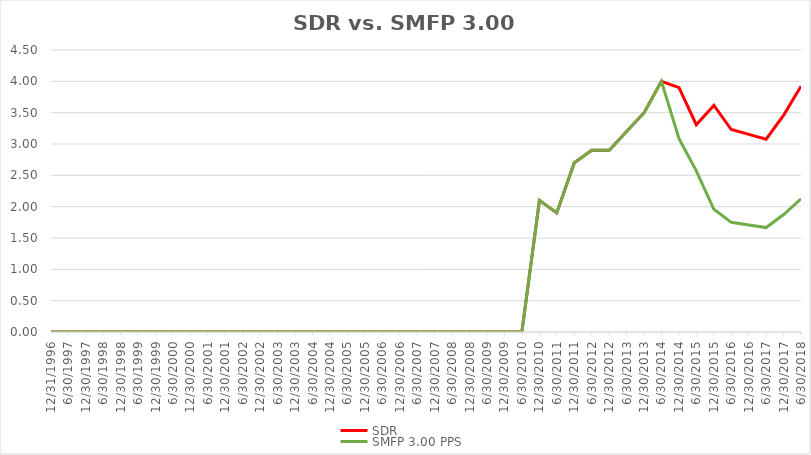
| Category | SDR | SMFP 3.00 PPS |
|---|---|---|
| 12/31/96 | 0 | 0 |
| 6/30/97 | 0 | 0 |
| 12/31/97 | 0 | 0 |
| 6/30/98 | 0 | 0 |
| 12/31/98 | 0 | 0 |
| 6/30/99 | 0 | 0 |
| 12/31/99 | 0 | 0 |
| 6/30/00 | 0 | 0 |
| 12/31/00 | 0 | 0 |
| 6/30/01 | 0 | 0 |
| 12/31/01 | 0 | 0 |
| 6/30/02 | 0 | 0 |
| 12/31/02 | 0 | 0 |
| 6/30/03 | 0 | 0 |
| 12/31/03 | 0 | 0 |
| 6/30/04 | 0 | 0 |
| 12/31/04 | 0 | 0 |
| 6/30/05 | 0 | 0 |
| 12/31/05 | 0 | 0 |
| 6/30/06 | 0 | 0 |
| 12/31/06 | 0 | 0 |
| 6/30/07 | 0 | 0 |
| 12/31/07 | 0 | 0 |
| 6/30/08 | 0 | 0 |
| 12/31/08 | 0 | 0 |
| 6/30/09 | 0 | 0 |
| 12/31/09 | 0 | 0 |
| 6/30/10 | 0 | 0 |
| 12/31/10 | 2.1 | 2.1 |
| 6/30/11 | 1.9 | 1.9 |
| 12/31/11 | 2.7 | 2.7 |
| 6/30/12 | 2.9 | 2.9 |
| 12/31/12 | 2.9 | 2.9 |
| 6/30/13 | 3.2 | 3.2 |
| 12/31/13 | 3.5 | 3.5 |
| 6/30/14 | 4 | 4 |
| 12/31/14 | 3.9 | 3.085 |
| 6/30/15 | 3.308 | 2.571 |
| 12/31/15 | 3.615 | 1.958 |
| 6/30/16 | 3.231 | 1.75 |
| 12/31/16 | 3.154 | 1.708 |
| 6/30/17 | 3.077 | 1.667 |
| 12/31/17 | 3.462 | 1.875 |
| 6/30/18 | 3.923 | 2.125 |